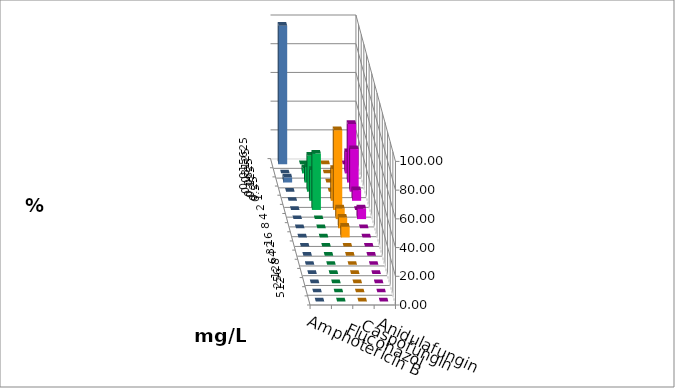
| Category | Amphotericin B | Fluconazol | Caspofungin | Anidulafungin |
|---|---|---|---|---|
| 0.015625 | 0 | 0 | 0 | 96.429 |
| 0.03125 | 3.571 | 0 | 14.815 | 0 |
| 0.0625 | 10.714 | 0 | 40.741 | 3.571 |
| 0.125 | 25 | 0 | 29.63 | 0 |
| 0.25 | 21.429 | 22.222 | 7.407 | 0 |
| 0.5 | 39.286 | 55.556 | 0 | 0 |
| 1.0 | 0 | 7.407 | 7.407 | 0 |
| 2.0 | 0 | 7.407 | 0 | 0 |
| 4.0 | 0 | 7.407 | 0 | 0 |
| 8.0 | 0 | 0 | 0 | 0 |
| 16.0 | 0 | 0 | 0 | 0 |
| 32.0 | 0 | 0 | 0 | 0 |
| 64.0 | 0 | 0 | 0 | 0 |
| 128.0 | 0 | 0 | 0 | 0 |
| 256.0 | 0 | 0 | 0 | 0 |
| 512.0 | 0 | 0 | 0 | 0 |